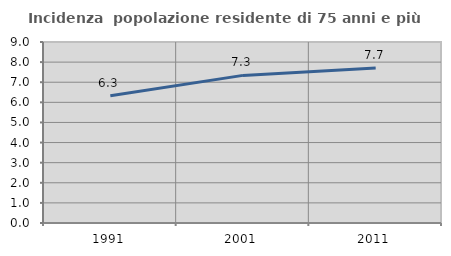
| Category | Incidenza  popolazione residente di 75 anni e più |
|---|---|
| 1991.0 | 6.323 |
| 2001.0 | 7.34 |
| 2011.0 | 7.712 |